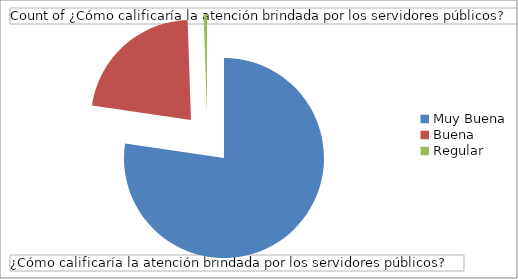
| Category | Total |
|---|---|
| Muy Buena | 143 |
| Buena | 41 |
| Regular | 1 |